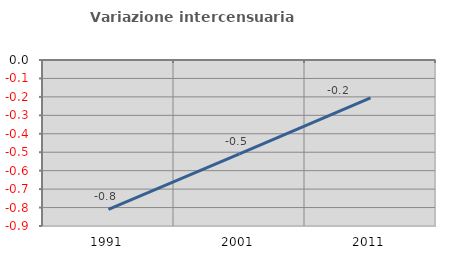
| Category | Variazione intercensuaria annua |
|---|---|
| 1991.0 | -0.81 |
| 2001.0 | -0.509 |
| 2011.0 | -0.205 |